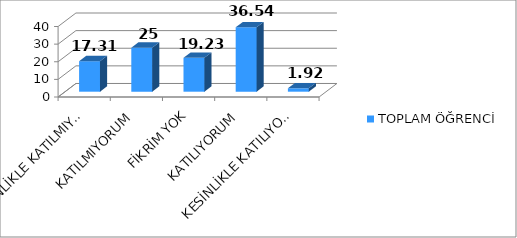
| Category | TOPLAM ÖĞRENCİ |
|---|---|
| KESİNLİKLE KATILMIYORUM | 17.31 |
| KATILMIYORUM | 25 |
| FİKRİM YOK | 19.23 |
| KATILIYORUM | 36.54 |
| KESİNLİKLE KATILIYORUM | 1.92 |